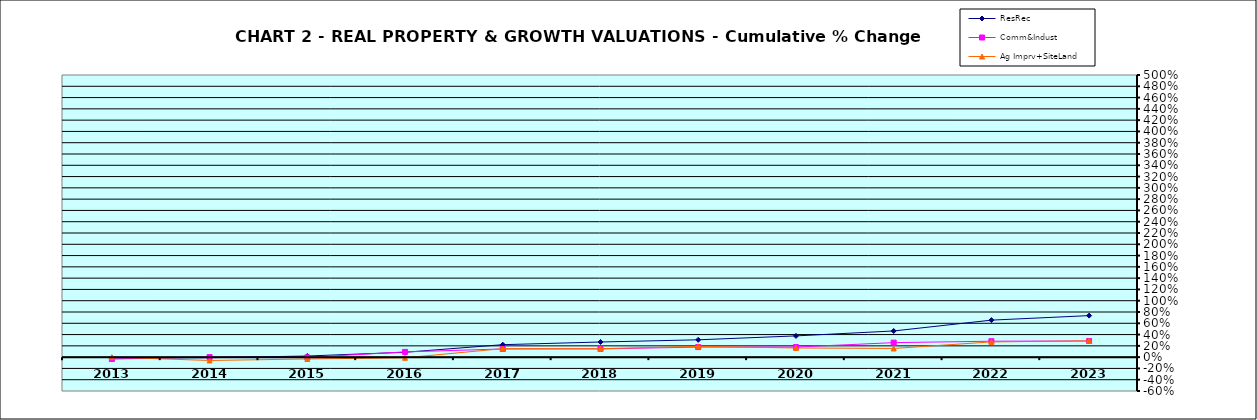
| Category | ResRec | Comm&Indust | Ag Imprv+SiteLand |
|---|---|---|---|
| 2013.0 | -0.013 | -0.034 | 0 |
| 2014.0 | -0.01 | 0.001 | -0.059 |
| 2015.0 | 0.02 | -0.004 | -0.033 |
| 2016.0 | 0.087 | 0.093 | -0.012 |
| 2017.0 | 0.221 | 0.145 | 0.151 |
| 2018.0 | 0.268 | 0.146 | 0.15 |
| 2019.0 | 0.307 | 0.178 | 0.191 |
| 2020.0 | 0.376 | 0.179 | 0.162 |
| 2021.0 | 0.464 | 0.257 | 0.154 |
| 2022.0 | 0.656 | 0.282 | 0.27 |
| 2023.0 | 0.736 | 0.287 | 0.289 |